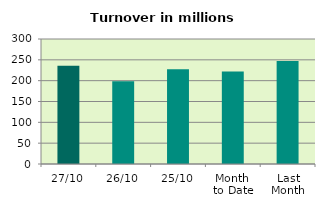
| Category | Series 0 |
|---|---|
| 27/10 | 235.833 |
| 26/10 | 198.677 |
| 25/10 | 227.676 |
| Month 
to Date | 222.155 |
| Last
Month | 247.353 |